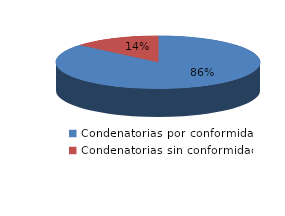
| Category | Series 0 |
|---|---|
| 0 | 119 |
| 1 | 19 |